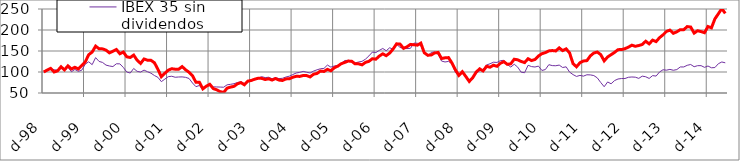
| Category | IBEX 35 sin dividendos | DAX |
|---|---|---|
| 1998-12-01 | 100 | 100 |
| 1999-01-01 | 105.319 | 104.615 |
| 1999-02-01 | 107.049 | 108.555 |
| 1999-03-01 | 105.344 | 100.054 |
| 1999-04-01 | 104.292 | 102.778 |
| 1999-05-01 | 108.041 | 112.461 |
| 1999-06-01 | 107.678 | 105.009 |
| 1999-07-01 | 111.036 | 114.607 |
| 1999-08-01 | 100.646 | 107.273 |
| 1999-09-01 | 106.037 | 111.197 |
| 1999-10-01 | 101.531 | 107.169 |
| 1999-11-01 | 104.301 | 115.542 |
| 1999-12-01 | 118.678 | 124.094 |
| 2000-01-01 | 124.307 | 141.178 |
| 2000-02-01 | 117.454 | 147.446 |
| 2000-03-01 | 134.25 | 161.614 |
| 2000-04-01 | 125.125 | 155.367 |
| 2000-05-01 | 122.785 | 155.063 |
| 2000-06-01 | 116.443 | 152.095 |
| 2000-07-01 | 114.314 | 145.532 |
| 2000-08-01 | 112.947 | 149.434 |
| 2000-09-01 | 119.597 | 153.599 |
| 2000-10-01 | 119.408 | 143.51 |
| 2000-11-01 | 110.956 | 147.626 |
| 2000-12-01 | 99.996 | 136.204 |
| 2001-01-01 | 97.537 | 134.546 |
| 2001-02-01 | 108.386 | 140.215 |
| 2001-03-01 | 101.566 | 128.058 |
| 2001-04-01 | 99.834 | 120.474 |
| 2001-05-01 | 104.51 | 131.009 |
| 2001-06-01 | 100.638 | 128.095 |
| 2001-07-01 | 97.147 | 127.768 |
| 2001-08-01 | 91.622 | 122.032 |
| 2001-09-01 | 87.293 | 106.533 |
| 2001-10-01 | 77.016 | 88.67 |
| 2001-11-01 | 83.03 | 96.955 |
| 2001-12-01 | 88.898 | 104.323 |
| 2002-01-01 | 89.912 | 107.913 |
| 2002-02-01 | 87.487 | 106.594 |
| 2002-03-01 | 88.125 | 106.602 |
| 2002-04-01 | 88.328 | 112.873 |
| 2002-05-01 | 87.308 | 105.426 |
| 2002-06-01 | 84.581 | 99.294 |
| 2002-07-01 | 73.809 | 91.323 |
| 2002-08-01 | 65.043 | 75.421 |
| 2002-09-01 | 67.895 | 75.483 |
| 2002-10-01 | 57.481 | 59.92 |
| 2002-11-01 | 65.734 | 66.193 |
| 2002-12-01 | 72.125 | 70.69 |
| 2003-01-01 | 64.636 | 60.493 |
| 2003-02-01 | 64.425 | 57.552 |
| 2003-03-01 | 64.104 | 53.321 |
| 2003-04-01 | 63.74 | 51.241 |
| 2003-05-01 | 69.482 | 61.527 |
| 2003-06-01 | 70.616 | 64.089 |
| 2003-07-01 | 72.155 | 65.804 |
| 2003-08-01 | 74.899 | 71.917 |
| 2003-09-01 | 77.029 | 74.685 |
| 2003-10-01 | 72.282 | 69.637 |
| 2003-11-01 | 77.253 | 78.308 |
| 2003-12-01 | 78.934 | 79.913 |
| 2004-01-01 | 82.841 | 82.923 |
| 2004-02-01 | 85.212 | 85.149 |
| 2004-03-01 | 88.871 | 84.79 |
| 2004-04-01 | 86.703 | 82.08 |
| 2004-05-01 | 87.482 | 83.812 |
| 2004-06-01 | 84.032 | 80.811 |
| 2004-07-01 | 86.568 | 84.384 |
| 2004-08-01 | 84.252 | 80.781 |
| 2004-09-01 | 85.001 | 79.838 |
| 2004-10-01 | 88.017 | 83.546 |
| 2004-11-01 | 90.134 | 83.916 |
| 2004-12-01 | 93.941 | 87.542 |
| 2005-01-01 | 97.691 | 89.748 |
| 2005-02-01 | 99.113 | 89.507 |
| 2005-03-01 | 101.419 | 91.674 |
| 2005-04-01 | 99.461 | 91.463 |
| 2005-05-01 | 97.646 | 88.337 |
| 2005-06-01 | 102.259 | 94.676 |
| 2005-07-01 | 105.239 | 96.556 |
| 2005-08-01 | 107.806 | 102.282 |
| 2005-09-01 | 108.504 | 101.28 |
| 2005-10-01 | 116.498 | 106.281 |
| 2005-11-01 | 111.643 | 102.945 |
| 2005-12-01 | 114.335 | 110.139 |
| 2006-01-01 | 115.492 | 113.975 |
| 2006-02-01 | 120.143 | 119.759 |
| 2006-03-01 | 127.435 | 122.688 |
| 2006-04-01 | 127.626 | 125.981 |
| 2006-05-01 | 127.331 | 125.684 |
| 2006-06-01 | 121.484 | 119.362 |
| 2006-07-01 | 123.874 | 119.469 |
| 2006-08-01 | 125.341 | 117.044 |
| 2006-09-01 | 130.549 | 122.896 |
| 2006-10-01 | 138.289 | 125.466 |
| 2006-11-01 | 147.461 | 131.582 |
| 2006-12-01 | 146.262 | 130.52 |
| 2007-01-01 | 151.465 | 137.961 |
| 2007-02-01 | 156.015 | 143.28 |
| 2007-03-01 | 150.591 | 138.867 |
| 2007-04-01 | 157.721 | 145.077 |
| 2007-05-01 | 153.907 | 154.941 |
| 2007-06-01 | 165.973 | 167.049 |
| 2007-07-01 | 158.512 | 166.43 |
| 2007-08-01 | 156.274 | 156.302 |
| 2007-09-01 | 155.752 | 159.954 |
| 2007-10-01 | 156.352 | 165.681 |
| 2007-11-01 | 168.736 | 164.812 |
| 2007-12-01 | 168.473 | 163.9 |
| 2008-01-01 | 162.555 | 168.711 |
| 2008-02-01 | 144.486 | 145.735 |
| 2008-03-01 | 137.717 | 139.906 |
| 2008-04-01 | 146.674 | 140.542 |
| 2008-05-01 | 147.737 | 145.32 |
| 2008-06-01 | 142.401 | 146.574 |
| 2008-07-01 | 126.029 | 132.085 |
| 2008-08-01 | 123.873 | 133.769 |
| 2008-09-01 | 125.204 | 134.299 |
| 2008-10-01 | 119.73 | 121.427 |
| 2008-11-01 | 98.844 | 105.126 |
| 2008-12-01 | 91.121 | 91.908 |
| 2009-01-01 | 98.458 | 100.595 |
| 2009-02-01 | 88.154 | 89.32 |
| 2009-03-01 | 77.844 | 77.588 |
| 2009-04-01 | 85.237 | 86.393 |
| 2009-05-01 | 96.769 | 99.743 |
| 2009-06-01 | 103.117 | 107.546 |
| 2009-07-01 | 106.038 | 102.587 |
| 2009-08-01 | 116.716 | 113.491 |
| 2009-09-01 | 119.628 | 111.409 |
| 2009-10-01 | 123.324 | 116.162 |
| 2009-11-01 | 122.763 | 113.574 |
| 2009-12-01 | 127.006 | 120.806 |
| 2010-01-01 | 127.84 | 124.587 |
| 2010-02-01 | 117.724 | 118.252 |
| 2010-03-01 | 111.725 | 119.486 |
| 2010-04-01 | 118.503 | 130.404 |
| 2010-05-01 | 111.596 | 128.968 |
| 2010-06-01 | 99.571 | 125.086 |
| 2010-07-01 | 98.27 | 122.496 |
| 2010-08-01 | 116.013 | 131.587 |
| 2010-09-01 | 112.902 | 127.232 |
| 2010-10-01 | 111.888 | 129.897 |
| 2010-11-01 | 114.023 | 138.127 |
| 2010-12-01 | 103.625 | 143.601 |
| 2011-01-01 | 105.873 | 146.176 |
| 2011-02-01 | 117.432 | 150.244 |
| 2011-03-01 | 115.226 | 151.06 |
| 2011-04-01 | 114.884 | 150.151 |
| 2011-05-01 | 116.462 | 157.425 |
| 2011-06-01 | 110.702 | 150.938 |
| 2011-07-01 | 112.336 | 155.162 |
| 2011-08-01 | 99.769 | 145.428 |
| 2011-09-01 | 93.804 | 119.844 |
| 2011-10-01 | 89.443 | 112.443 |
| 2011-11-01 | 91.861 | 122.017 |
| 2011-12-01 | 90.163 | 126.228 |
| 2012-01-01 | 93.405 | 127.057 |
| 2012-02-01 | 93.113 | 138.373 |
| 2012-03-01 | 91.519 | 145.173 |
| 2012-04-01 | 86.113 | 147.575 |
| 2012-05-01 | 75.066 | 141.396 |
| 2012-06-01 | 64.937 | 126.529 |
| 2012-07-01 | 76.276 | 135.852 |
| 2012-08-01 | 71.95 | 141.256 |
| 2012-09-01 | 79.597 | 146.701 |
| 2012-10-01 | 83.343 | 153.223 |
| 2012-11-01 | 84.439 | 153.41 |
| 2012-12-01 | 84.469 | 155.492 |
| 2013-01-01 | 87.448 | 159.197 |
| 2013-02-01 | 88.114 | 163.819 |
| 2013-03-01 | 87.658 | 161.2 |
| 2013-04-01 | 84.798 | 163.023 |
| 2013-05-01 | 90.141 | 165.499 |
| 2013-06-01 | 88.7 | 173.28 |
| 2013-07-01 | 84.66 | 166.967 |
| 2013-08-01 | 91.439 | 175.893 |
| 2013-09-01 | 90.255 | 172.404 |
| 2013-10-01 | 100.018 | 181.715 |
| 2013-11-01 | 105.337 | 188.38 |
| 2013-12-01 | 104.344 | 196.623 |
| 2014-01-01 | 106.177 | 199.764 |
| 2014-02-01 | 104.129 | 192.117 |
| 2014-03-01 | 105.77 | 195.722 |
| 2014-04-01 | 112.027 | 200.842 |
| 2014-05-01 | 111.983 | 200.832 |
| 2014-06-01 | 115.928 | 208.086 |
| 2014-07-01 | 117.859 | 207.088 |
| 2014-08-01 | 112.572 | 192.61 |
| 2014-09-01 | 115.061 | 198.234 |
| 2014-10-01 | 115.133 | 196.206 |
| 2014-11-01 | 111.077 | 193.48 |
| 2014-12-01 | 114.272 | 208.366 |
| 2015-01-01 | 110.061 | 205.063 |
| 2015-02-01 | 110.582 | 226.445 |
| 2015-03-01 | 119.687 | 238.624 |
| 2015-04-01 | 123.876 | 250.984 |
| 2015-05-01 | 121.898 | 239.545 |